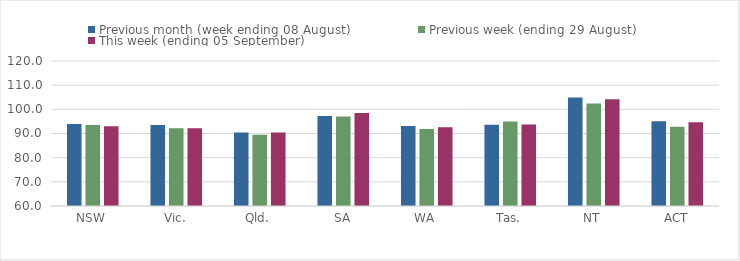
| Category | Previous month (week ending 08 August) | Previous week (ending 29 August) | This week (ending 05 September) |
|---|---|---|---|
| NSW | 93.88 | 93.55 | 93.05 |
| Vic. | 93.54 | 92.13 | 92.13 |
| Qld. | 90.44 | 89.47 | 90.37 |
| SA | 97.19 | 97.01 | 98.5 |
| WA | 93.11 | 91.87 | 92.6 |
| Tas. | 93.64 | 94.95 | 93.76 |
| NT | 104.85 | 102.42 | 104.16 |
| ACT | 95.1 | 92.8 | 94.65 |